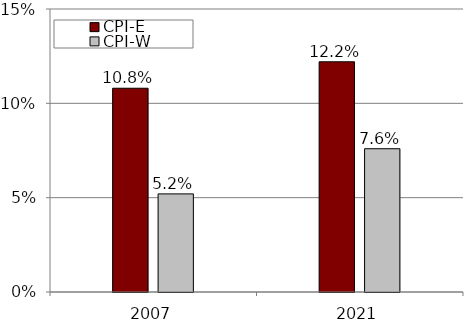
| Category | CPI-E | CPI-W |
|---|---|---|
| 2007 | 0.108 | 0.052 |
| 2021 | 0.122 | 0.076 |